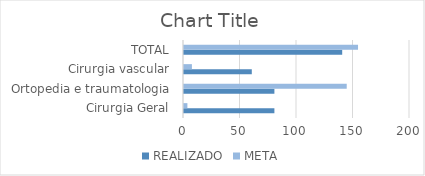
| Category | REALIZADO | META |
|---|---|---|
| Cirurgia Geral | 80 | 3 |
| Ortopedia e traumatologia | 80 | 144 |
| Cirurgia vascular | 60 | 7 |
| TOTAL | 140 | 154 |